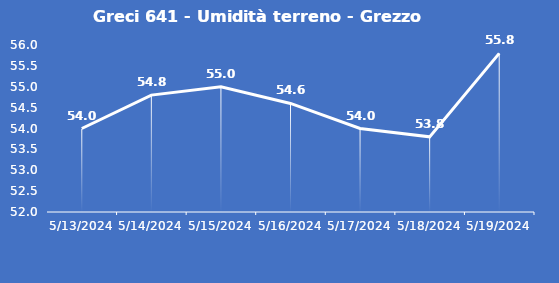
| Category | Greci 641 - Umidità terreno - Grezzo (%VWC) |
|---|---|
| 5/13/24 | 54 |
| 5/14/24 | 54.8 |
| 5/15/24 | 55 |
| 5/16/24 | 54.6 |
| 5/17/24 | 54 |
| 5/18/24 | 53.8 |
| 5/19/24 | 55.8 |